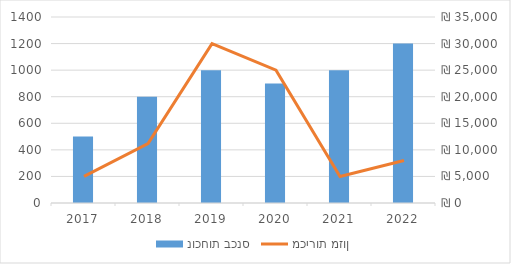
| Category | נוכחות בכנס |
|---|---|
| 2017.0 | 500 |
| 2018.0 | 800 |
| 2019.0 | 1000 |
| 2020.0 | 900 |
| 2021.0 | 1000 |
| 2022.0 | 1200 |